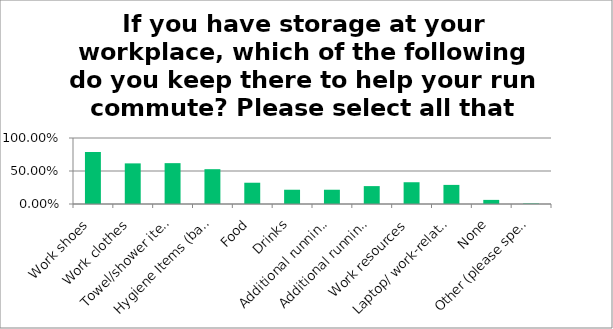
| Category | Responses |
|---|---|
| Work shoes | 0.788 |
| Work clothes | 0.615 |
| Towel/shower items | 0.619 |
| Hygiene Items (baby wipes, deodorant, etc.) | 0.528 |
| Food | 0.322 |
| Drinks | 0.216 |
| Additional running shoes | 0.216 |
| Additional running clothes | 0.271 |
| Work resources | 0.33 |
| Laptop/ work-related technology | 0.289 |
| None | 0.062 |
| Other (please specify) | 0.007 |